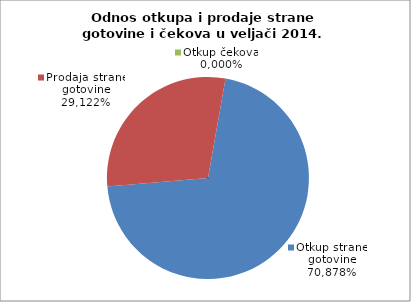
| Category | Otkup strane gotovine |
|---|---|
| 0 | 0.709 |
| 1 | 0.291 |
| 2 | 0 |